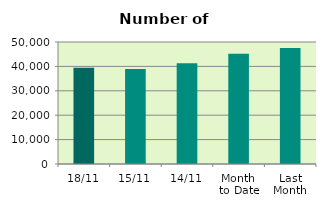
| Category | Series 0 |
|---|---|
| 18/11 | 39468 |
| 15/11 | 38972 |
| 14/11 | 41332 |
| Month 
to Date | 45141.333 |
| Last
Month | 47528 |